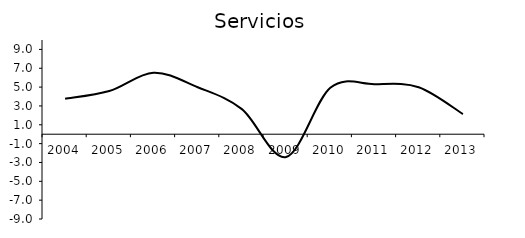
| Category | Servicios |
|---|---|
| 2004.0 | 3.758 |
| 2005.0 | 4.582 |
| 2006.0 | 6.522 |
| 2007.0 | 4.988 |
| 2008.0 | 2.663 |
| 2009.0 | -2.419 |
| 2010.0 | 4.926 |
| 2011.0 | 5.314 |
| 2012.0 | 4.99 |
| 2013.0 | 2.138 |